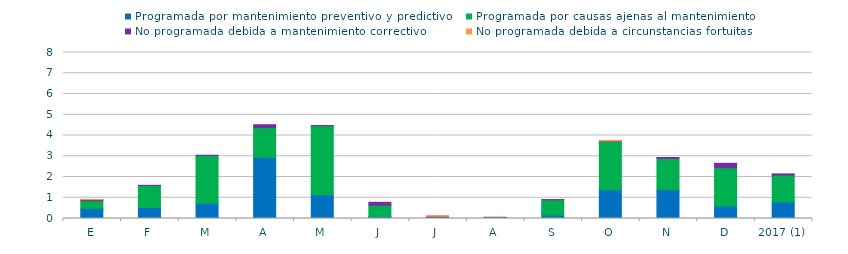
| Category | Programada por mantenimiento preventivo y predictivo | Programada por causas ajenas al mantenimiento  | No programada debida a mantenimiento correctivo  | No programada debida a circunstancias fortuitas  |
|---|---|---|---|---|
| E | 0.49 | 0.36 | 0.06 | 0.01 |
| F | 0.53 | 1.06 | 0.01 | 0 |
| M | 0.74 | 2.3 | 0.01 | 0 |
| A | 2.95 | 1.43 | 0.14 | 0 |
| M | 1.15 | 3.32 | 0.01 | 0 |
| J | 0.09 | 0.55 | 0.14 | 0 |
| J | 0.04 | 0 | 0.07 | 0.02 |
| A | 0.03 | 0.01 | 0.02 | 0 |
| S | 0.16 | 0.74 | 0.01 | 0 |
| O | 1.39 | 2.34 | 0.01 | 0.02 |
| N | 1.39 | 1.5 | 0.05 | 0 |
| D | 0.6 | 1.85 | 0.21 | 0 |
| 2017 (1) | 0.8 | 1.29 | 0.06 | 0 |